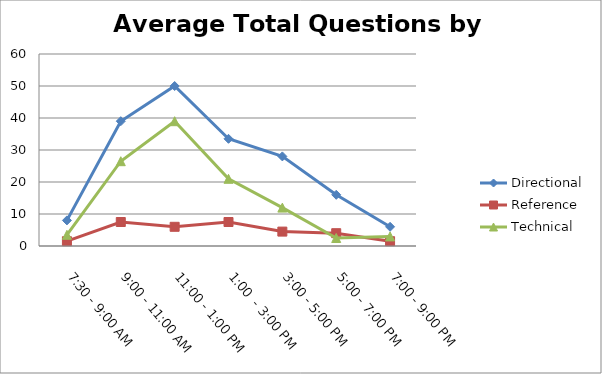
| Category | Directional | Reference | Technical |
|---|---|---|---|
| 7:30 - 9:00 AM | 8 | 1.5 | 3.5 |
| 9:00 - 11:00 AM | 39 | 7.5 | 26.5 |
| 11:00 - 1:00 PM | 50 | 6 | 39 |
| 1:00  - 3:00 PM | 33.5 | 7.5 | 21 |
| 3:00 - 5:00 PM | 28 | 4.5 | 12 |
| 5:00 - 7:00 PM | 16 | 4 | 2.5 |
| 7:00 - 9:00 PM | 6 | 1.5 | 3 |